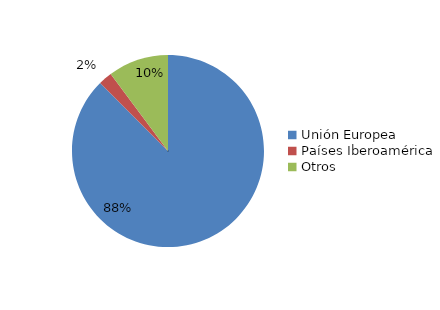
| Category | Series 0 |
|---|---|
| Unión Europea | 7423 |
| Países Iberoamérica | 196 |
| Otros | 864 |